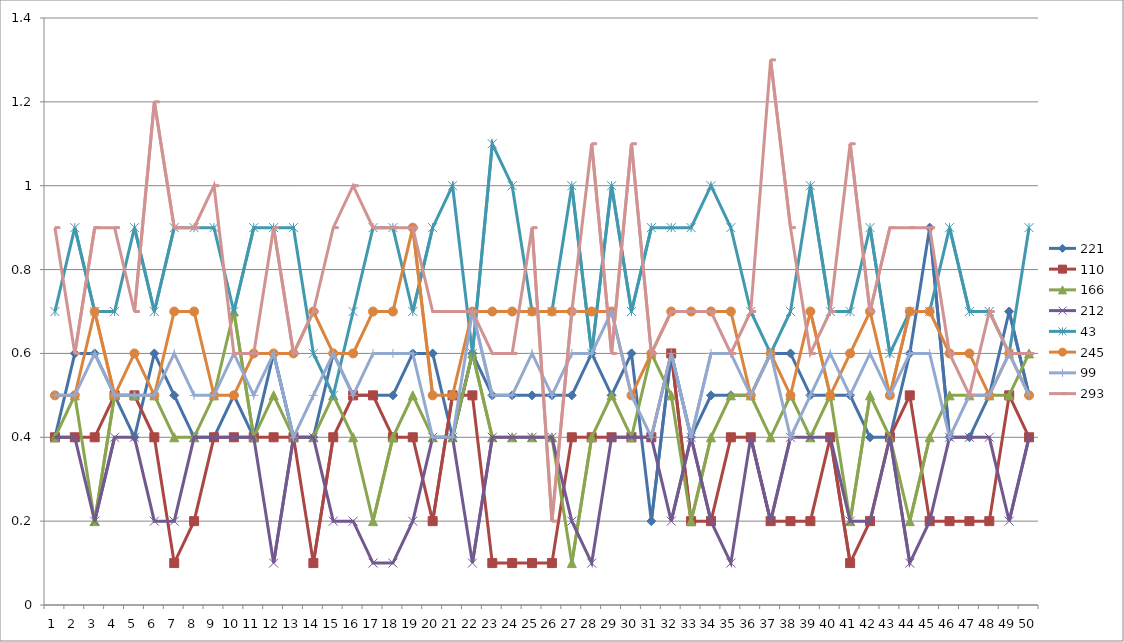
| Category | 221 | 110 | 166 | 212 | 43 | 245 | 99 | 293 |
|---|---|---|---|---|---|---|---|---|
| 0 | 0.4 | 0.4 | 0.4 | 0.4 | 0.7 | 0.5 | 0.5 | 0.9 |
| 1 | 0.6 | 0.4 | 0.5 | 0.4 | 0.9 | 0.5 | 0.5 | 0.6 |
| 2 | 0.6 | 0.4 | 0.2 | 0.2 | 0.7 | 0.7 | 0.6 | 0.9 |
| 3 | 0.5 | 0.5 | 0.5 | 0.4 | 0.7 | 0.5 | 0.5 | 0.9 |
| 4 | 0.4 | 0.5 | 0.5 | 0.4 | 0.9 | 0.6 | 0.5 | 0.7 |
| 5 | 0.6 | 0.4 | 0.5 | 0.2 | 0.7 | 0.5 | 0.5 | 1.2 |
| 6 | 0.5 | 0.1 | 0.4 | 0.2 | 0.9 | 0.7 | 0.6 | 0.9 |
| 7 | 0.4 | 0.2 | 0.4 | 0.4 | 0.9 | 0.7 | 0.5 | 0.9 |
| 8 | 0.4 | 0.4 | 0.5 | 0.4 | 0.9 | 0.5 | 0.5 | 1 |
| 9 | 0.5 | 0.4 | 0.7 | 0.4 | 0.7 | 0.5 | 0.6 | 0.6 |
| 10 | 0.4 | 0.4 | 0.4 | 0.4 | 0.9 | 0.6 | 0.5 | 0.6 |
| 11 | 0.6 | 0.4 | 0.5 | 0.1 | 0.9 | 0.6 | 0.6 | 0.9 |
| 12 | 0.4 | 0.4 | 0.4 | 0.4 | 0.9 | 0.6 | 0.4 | 0.6 |
| 13 | 0.4 | 0.1 | 0.4 | 0.4 | 0.6 | 0.7 | 0.5 | 0.7 |
| 14 | 0.6 | 0.4 | 0.5 | 0.2 | 0.5 | 0.6 | 0.6 | 0.9 |
| 15 | 0.5 | 0.5 | 0.4 | 0.2 | 0.7 | 0.6 | 0.5 | 1 |
| 16 | 0.5 | 0.5 | 0.2 | 0.1 | 0.9 | 0.7 | 0.6 | 0.9 |
| 17 | 0.5 | 0.4 | 0.4 | 0.1 | 0.9 | 0.7 | 0.6 | 0.9 |
| 18 | 0.6 | 0.4 | 0.5 | 0.2 | 0.7 | 0.9 | 0.6 | 0.9 |
| 19 | 0.6 | 0.2 | 0.4 | 0.4 | 0.9 | 0.5 | 0.4 | 0.7 |
| 20 | 0.4 | 0.5 | 0.4 | 0.4 | 1 | 0.5 | 0.4 | 0.7 |
| 21 | 0.6 | 0.5 | 0.6 | 0.1 | 0.6 | 0.7 | 0.7 | 0.7 |
| 22 | 0.5 | 0.1 | 0.4 | 0.4 | 1.1 | 0.7 | 0.5 | 0.6 |
| 23 | 0.5 | 0.1 | 0.4 | 0.4 | 1 | 0.7 | 0.5 | 0.6 |
| 24 | 0.5 | 0.1 | 0.4 | 0.4 | 0.7 | 0.7 | 0.6 | 0.9 |
| 25 | 0.5 | 0.1 | 0.4 | 0.4 | 0.7 | 0.7 | 0.5 | 0.2 |
| 26 | 0.5 | 0.4 | 0.1 | 0.2 | 1 | 0.7 | 0.6 | 0.7 |
| 27 | 0.6 | 0.4 | 0.4 | 0.1 | 0.6 | 0.7 | 0.6 | 1.1 |
| 28 | 0.5 | 0.4 | 0.5 | 0.4 | 1 | 0.7 | 0.7 | 0.6 |
| 29 | 0.6 | 0.4 | 0.4 | 0.4 | 0.7 | 0.5 | 0.5 | 1.1 |
| 30 | 0.2 | 0.4 | 0.6 | 0.4 | 0.9 | 0.6 | 0.4 | 0.6 |
| 31 | 0.6 | 0.6 | 0.5 | 0.2 | 0.9 | 0.7 | 0.6 | 0.7 |
| 32 | 0.4 | 0.2 | 0.2 | 0.4 | 0.9 | 0.7 | 0.4 | 0.7 |
| 33 | 0.5 | 0.2 | 0.4 | 0.2 | 1 | 0.7 | 0.6 | 0.7 |
| 34 | 0.5 | 0.4 | 0.5 | 0.1 | 0.9 | 0.7 | 0.6 | 0.6 |
| 35 | 0.5 | 0.4 | 0.5 | 0.4 | 0.7 | 0.5 | 0.5 | 0.7 |
| 36 | 0.6 | 0.2 | 0.4 | 0.2 | 0.6 | 0.6 | 0.6 | 1.3 |
| 37 | 0.6 | 0.2 | 0.5 | 0.4 | 0.7 | 0.5 | 0.4 | 0.9 |
| 38 | 0.5 | 0.2 | 0.4 | 0.4 | 1 | 0.7 | 0.5 | 0.6 |
| 39 | 0.5 | 0.4 | 0.5 | 0.4 | 0.7 | 0.5 | 0.6 | 0.7 |
| 40 | 0.5 | 0.1 | 0.2 | 0.2 | 0.7 | 0.6 | 0.5 | 1.1 |
| 41 | 0.4 | 0.2 | 0.5 | 0.2 | 0.9 | 0.7 | 0.6 | 0.7 |
| 42 | 0.4 | 0.4 | 0.4 | 0.4 | 0.6 | 0.5 | 0.5 | 0.9 |
| 43 | 0.6 | 0.5 | 0.2 | 0.1 | 0.7 | 0.7 | 0.6 | 0.9 |
| 44 | 0.9 | 0.2 | 0.4 | 0.2 | 0.7 | 0.7 | 0.6 | 0.9 |
| 45 | 0.4 | 0.2 | 0.5 | 0.4 | 0.9 | 0.6 | 0.4 | 0.6 |
| 46 | 0.4 | 0.2 | 0.5 | 0.4 | 0.7 | 0.6 | 0.5 | 0.5 |
| 47 | 0.5 | 0.2 | 0.5 | 0.4 | 0.7 | 0.5 | 0.5 | 0.7 |
| 48 | 0.7 | 0.5 | 0.5 | 0.2 | 0.6 | 0.6 | 0.6 | 0.6 |
| 49 | 0.5 | 0.4 | 0.6 | 0.4 | 0.9 | 0.5 | 0.5 | 0.6 |